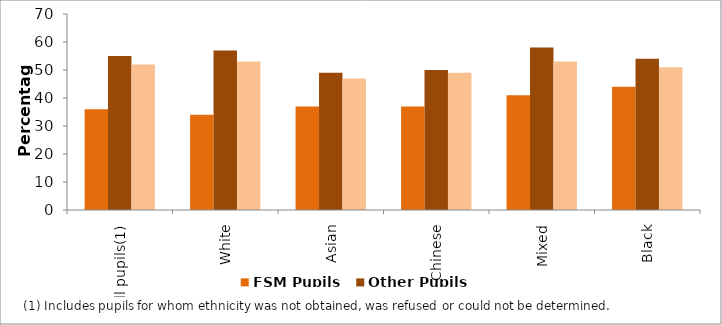
| Category | FSM Pupils | Other Pupils | All Pupils |
|---|---|---|---|
| All pupils(1) | 36 | 55 | 52 |
| White | 34 | 57 | 53 |
| Asian | 37 | 49 | 47 |
| Chinese | 37 | 50 | 49 |
| Mixed | 41 | 58 | 53 |
| Black | 44 | 54 | 51 |